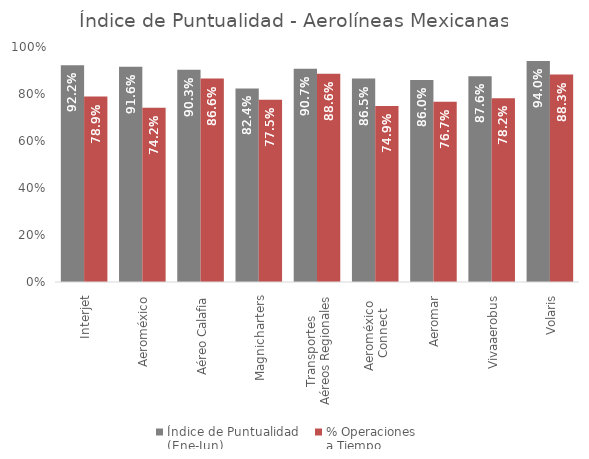
| Category | Índice de Puntualidad
(Ene-Jun) | % Operaciones 
a Tiempo |
|---|---|---|
| Interjet | 0.922 | 0.789 |
| Aeroméxico | 0.916 | 0.742 |
| Aéreo Calafia | 0.903 | 0.866 |
| Magnicharters | 0.824 | 0.775 |
| Transportes 
Aéreos Regionales | 0.907 | 0.886 |
| Aeroméxico 
Connect | 0.865 | 0.749 |
| Aeromar | 0.86 | 0.767 |
| Vivaaerobus | 0.876 | 0.782 |
| Volaris | 0.94 | 0.883 |